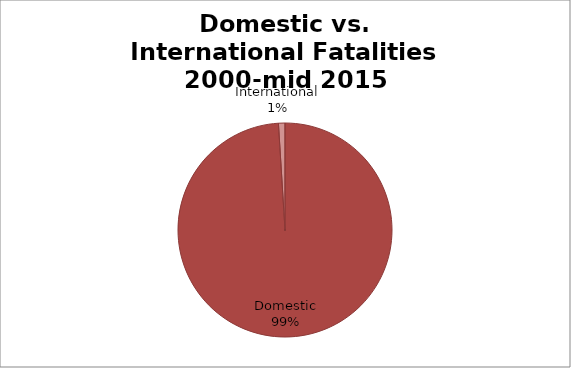
| Category | Series 0 |
|---|---|
| Domestic | 20650 |
| International | 205 |